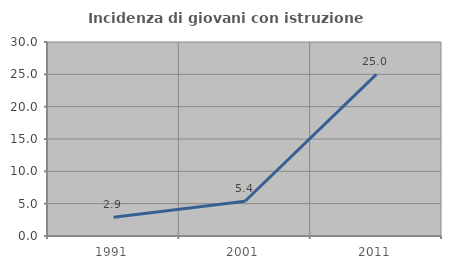
| Category | Incidenza di giovani con istruzione universitaria |
|---|---|
| 1991.0 | 2.899 |
| 2001.0 | 5.376 |
| 2011.0 | 25 |